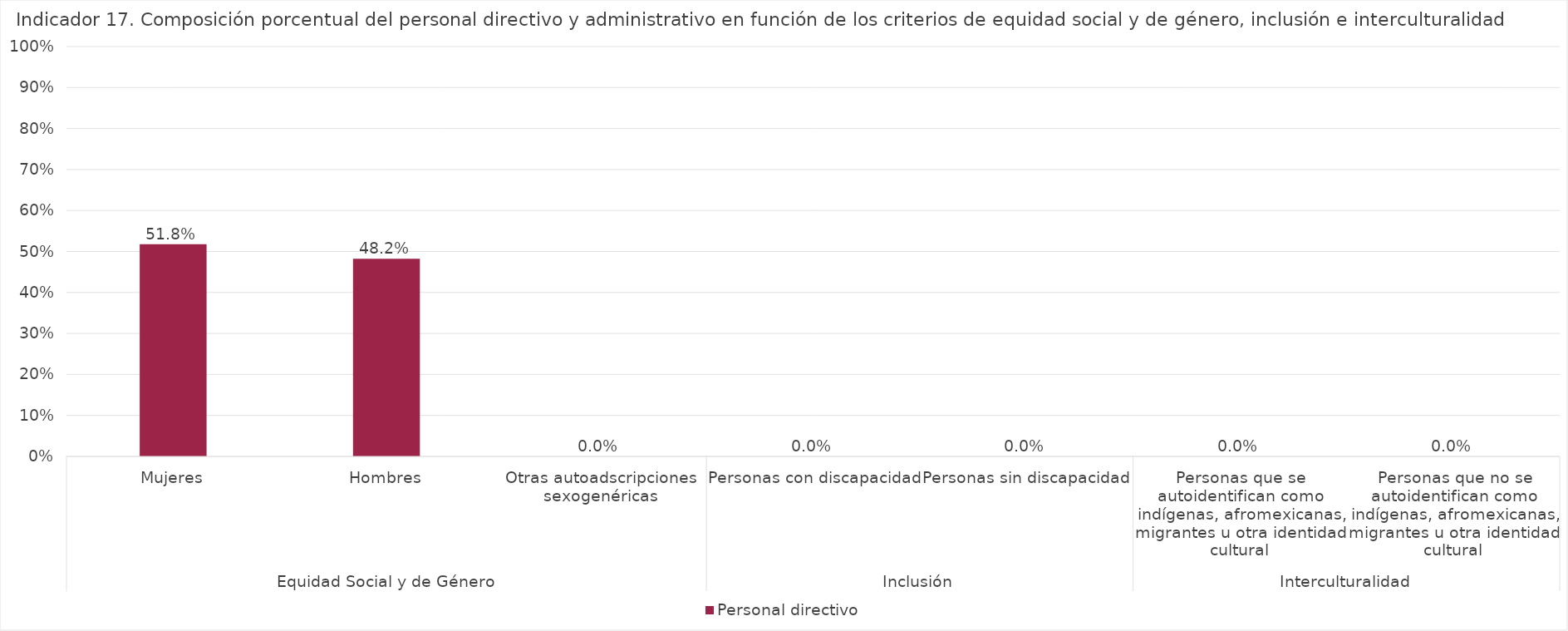
| Category | Personal directivo |
|---|---|
| 0 | 0.518 |
| 1 | 0.482 |
| 2 | 0 |
| 3 | 0 |
| 4 | 0 |
| 5 | 0 |
| 6 | 0 |